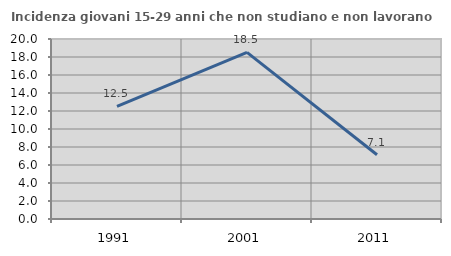
| Category | Incidenza giovani 15-29 anni che non studiano e non lavorano  |
|---|---|
| 1991.0 | 12.524 |
| 2001.0 | 18.519 |
| 2011.0 | 7.143 |